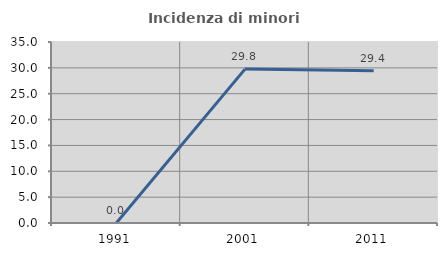
| Category | Incidenza di minori stranieri |
|---|---|
| 1991.0 | 0 |
| 2001.0 | 29.762 |
| 2011.0 | 29.448 |